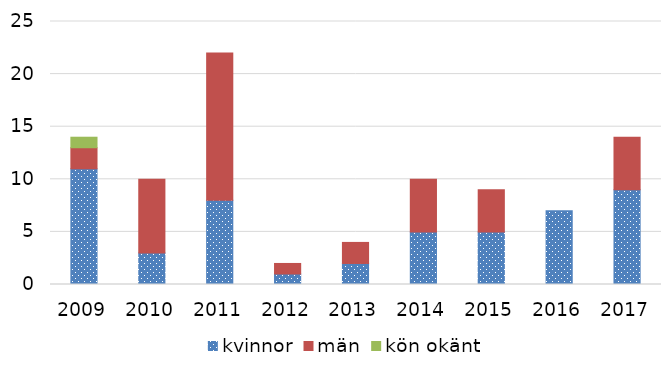
| Category | kvinnor | män | kön okänt |
|---|---|---|---|
| 2009 | 11 | 2 | 1 |
| 2010 | 3 | 7 | 0 |
| 2011 | 8 | 14 | 0 |
| 2012 | 1 | 1 | 0 |
| 2013 | 2 | 2 | 0 |
| 2014 | 5 | 5 | 0 |
| 2015 | 5 | 4 | 0 |
| 2016 | 7 | 0 | 0 |
| 2017 | 9 | 5 | 0 |